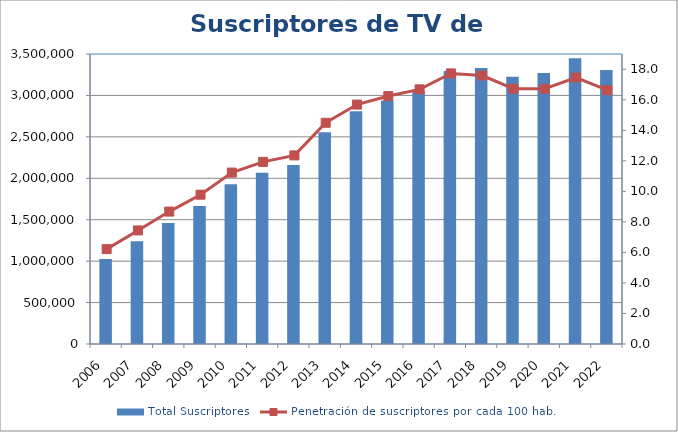
| Category | Total Suscriptores |
|---|---|
| 0 | 1026667 |
| 1 | 1241346 |
| 2 | 1461490 |
| 3 | 1664032 |
| 4 | 1928694 |
| 5 | 2067368 |
| 6 | 2159979 |
| 7 | 2555620 |
| 8 | 2809981 |
| 9 | 2940023 |
| 10 | 3050347 |
| 11 | 3294954 |
| 12 | 3329543 |
| 13 | 3224710 |
| 14 | 3272022 |
| 15 | 3448808 |
| 16 | 3308370 |